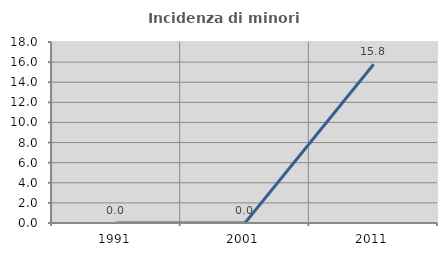
| Category | Incidenza di minori stranieri |
|---|---|
| 1991.0 | 0 |
| 2001.0 | 0 |
| 2011.0 | 15.789 |